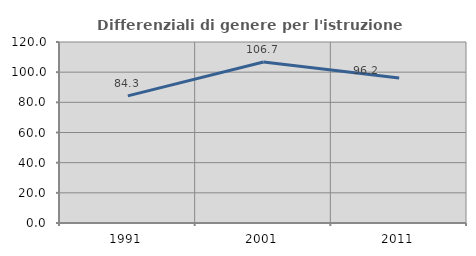
| Category | Differenziali di genere per l'istruzione superiore |
|---|---|
| 1991.0 | 84.285 |
| 2001.0 | 106.701 |
| 2011.0 | 96.187 |